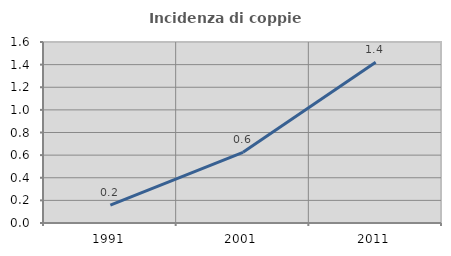
| Category | Incidenza di coppie miste |
|---|---|
| 1991.0 | 0.158 |
| 2001.0 | 0.625 |
| 2011.0 | 1.421 |